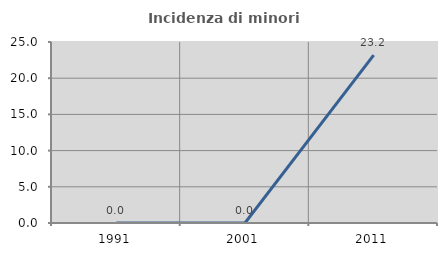
| Category | Incidenza di minori stranieri |
|---|---|
| 1991.0 | 0 |
| 2001.0 | 0 |
| 2011.0 | 23.188 |